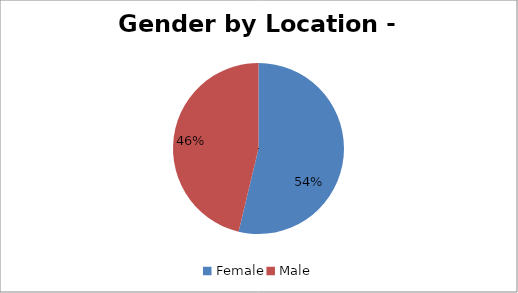
| Category | Leeds |
|---|---|
| Female | 330 |
| Male | 284 |